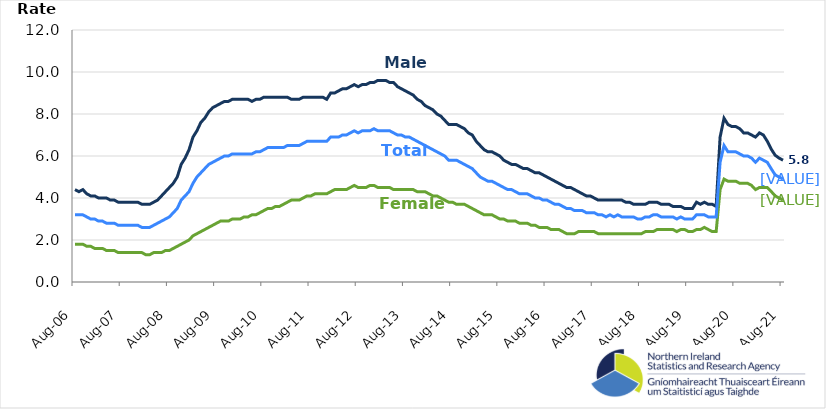
| Category | Male | Female | Total |
|---|---|---|---|
| 2006-08-01 | 4.4 | 1.8 | 3.2 |
| 2006-09-01 | 4.3 | 1.8 | 3.2 |
| 2006-10-01 | 4.4 | 1.8 | 3.2 |
| 2006-11-01 | 4.2 | 1.7 | 3.1 |
| 2006-12-01 | 4.1 | 1.7 | 3 |
| 2007-01-01 | 4.1 | 1.6 | 3 |
| 2007-02-01 | 4 | 1.6 | 2.9 |
| 2007-03-01 | 4 | 1.6 | 2.9 |
| 2007-04-01 | 4 | 1.5 | 2.8 |
| 2007-05-01 | 3.9 | 1.5 | 2.8 |
| 2007-06-01 | 3.9 | 1.5 | 2.8 |
| 2007-07-01 | 3.8 | 1.4 | 2.7 |
| 2007-08-01 | 3.8 | 1.4 | 2.7 |
| 2007-09-01 | 3.8 | 1.4 | 2.7 |
| 2007-10-01 | 3.8 | 1.4 | 2.7 |
| 2007-11-01 | 3.8 | 1.4 | 2.7 |
| 2007-12-01 | 3.8 | 1.4 | 2.7 |
| 2008-01-01 | 3.7 | 1.4 | 2.6 |
| 2008-02-01 | 3.7 | 1.3 | 2.6 |
| 2008-03-01 | 3.7 | 1.3 | 2.6 |
| 2008-04-01 | 3.8 | 1.4 | 2.7 |
| 2008-05-01 | 3.9 | 1.4 | 2.8 |
| 2008-06-01 | 4.1 | 1.4 | 2.9 |
| 2008-07-01 | 4.3 | 1.5 | 3 |
| 2008-08-01 | 4.5 | 1.5 | 3.1 |
| 2008-09-01 | 4.7 | 1.6 | 3.3 |
| 2008-10-01 | 5 | 1.7 | 3.5 |
| 2008-11-01 | 5.6 | 1.8 | 3.9 |
| 2008-12-01 | 5.9 | 1.9 | 4.1 |
| 2009-01-01 | 6.3 | 2 | 4.3 |
| 2009-02-01 | 6.9 | 2.2 | 4.7 |
| 2009-03-01 | 7.2 | 2.3 | 5 |
| 2009-04-01 | 7.6 | 2.4 | 5.2 |
| 2009-05-01 | 7.8 | 2.5 | 5.4 |
| 2009-06-01 | 8.1 | 2.6 | 5.6 |
| 2009-07-01 | 8.3 | 2.7 | 5.7 |
| 2009-08-01 | 8.4 | 2.8 | 5.8 |
| 2009-09-01 | 8.5 | 2.9 | 5.9 |
| 2009-10-01 | 8.6 | 2.9 | 6 |
| 2009-11-01 | 8.6 | 2.9 | 6 |
| 2009-12-01 | 8.7 | 3 | 6.1 |
| 2010-01-01 | 8.7 | 3 | 6.1 |
| 2010-02-01 | 8.7 | 3 | 6.1 |
| 2010-03-01 | 8.7 | 3.1 | 6.1 |
| 2010-04-01 | 8.7 | 3.1 | 6.1 |
| 2010-05-01 | 8.6 | 3.2 | 6.1 |
| 2010-06-01 | 8.7 | 3.2 | 6.2 |
| 2010-07-01 | 8.7 | 3.3 | 6.2 |
| 2010-08-01 | 8.8 | 3.4 | 6.3 |
| 2010-09-01 | 8.8 | 3.5 | 6.4 |
| 2010-10-01 | 8.8 | 3.5 | 6.4 |
| 2010-11-01 | 8.8 | 3.6 | 6.4 |
| 2010-12-01 | 8.8 | 3.6 | 6.4 |
| 2011-01-01 | 8.8 | 3.7 | 6.4 |
| 2011-02-01 | 8.8 | 3.8 | 6.5 |
| 2011-03-01 | 8.7 | 3.9 | 6.5 |
| 2011-04-01 | 8.7 | 3.9 | 6.5 |
| 2011-05-01 | 8.7 | 3.9 | 6.5 |
| 2011-06-01 | 8.8 | 4 | 6.6 |
| 2011-07-01 | 8.8 | 4.1 | 6.7 |
| 2011-08-01 | 8.8 | 4.1 | 6.7 |
| 2011-09-01 | 8.8 | 4.2 | 6.7 |
| 2011-10-01 | 8.8 | 4.2 | 6.7 |
| 2011-11-01 | 8.8 | 4.2 | 6.7 |
| 2011-12-01 | 8.7 | 4.2 | 6.7 |
| 2012-01-01 | 9 | 4.3 | 6.9 |
| 2012-02-01 | 9 | 4.4 | 6.9 |
| 2012-03-01 | 9.1 | 4.4 | 6.9 |
| 2012-04-01 | 9.2 | 4.4 | 7 |
| 2012-05-01 | 9.2 | 4.4 | 7 |
| 2012-06-01 | 9.3 | 4.5 | 7.1 |
| 2012-07-01 | 9.4 | 4.6 | 7.2 |
| 2012-08-01 | 9.3 | 4.5 | 7.1 |
| 2012-09-01 | 9.4 | 4.5 | 7.2 |
| 2012-10-01 | 9.4 | 4.5 | 7.2 |
| 2012-11-01 | 9.5 | 4.6 | 7.2 |
| 2012-12-01 | 9.5 | 4.6 | 7.3 |
| 2013-01-01 | 9.6 | 4.5 | 7.2 |
| 2013-02-01 | 9.6 | 4.5 | 7.2 |
| 2013-03-01 | 9.6 | 4.5 | 7.2 |
| 2013-04-01 | 9.5 | 4.5 | 7.2 |
| 2013-05-01 | 9.5 | 4.4 | 7.1 |
| 2013-06-01 | 9.3 | 4.4 | 7 |
| 2013-07-01 | 9.2 | 4.4 | 7 |
| 2013-08-01 | 9.1 | 4.4 | 6.9 |
| 2013-09-01 | 9 | 4.4 | 6.9 |
| 2013-10-01 | 8.9 | 4.4 | 6.8 |
| 2013-11-01 | 8.7 | 4.3 | 6.7 |
| 2013-12-01 | 8.6 | 4.3 | 6.6 |
| 2014-01-01 | 8.4 | 4.3 | 6.5 |
| 2014-02-01 | 8.3 | 4.2 | 6.4 |
| 2014-03-01 | 8.2 | 4.1 | 6.3 |
| 2014-04-01 | 8 | 4.1 | 6.2 |
| 2014-05-01 | 7.9 | 4 | 6.1 |
| 2014-06-01 | 7.7 | 3.9 | 6 |
| 2014-07-01 | 7.5 | 3.8 | 5.8 |
| 2014-08-01 | 7.5 | 3.8 | 5.8 |
| 2014-09-01 | 7.5 | 3.7 | 5.8 |
| 2014-10-01 | 7.4 | 3.7 | 5.7 |
| 2014-11-01 | 7.3 | 3.7 | 5.6 |
| 2014-12-01 | 7.1 | 3.6 | 5.5 |
| 2015-01-01 | 7 | 3.5 | 5.4 |
| 2015-02-01 | 6.7 | 3.4 | 5.2 |
| 2015-03-01 | 6.5 | 3.3 | 5 |
| 2015-04-01 | 6.3 | 3.2 | 4.9 |
| 2015-05-01 | 6.2 | 3.2 | 4.8 |
| 2015-06-01 | 6.2 | 3.2 | 4.8 |
| 2015-07-01 | 6.1 | 3.1 | 4.7 |
| 2015-08-01 | 6 | 3 | 4.6 |
| 2015-09-01 | 5.8 | 3 | 4.5 |
| 2015-10-01 | 5.7 | 2.9 | 4.4 |
| 2015-11-01 | 5.6 | 2.9 | 4.4 |
| 2015-12-01 | 5.6 | 2.9 | 4.3 |
| 2016-01-01 | 5.5 | 2.8 | 4.2 |
| 2016-02-01 | 5.4 | 2.8 | 4.2 |
| 2016-03-01 | 5.4 | 2.8 | 4.2 |
| 2016-04-01 | 5.3 | 2.7 | 4.1 |
| 2016-05-01 | 5.2 | 2.7 | 4 |
| 2016-06-01 | 5.2 | 2.6 | 4 |
| 2016-07-01 | 5.1 | 2.6 | 3.9 |
| 2016-08-01 | 5 | 2.6 | 3.9 |
| 2016-09-01 | 4.9 | 2.5 | 3.8 |
| 2016-10-01 | 4.8 | 2.5 | 3.7 |
| 2016-11-01 | 4.7 | 2.5 | 3.7 |
| 2016-12-01 | 4.6 | 2.4 | 3.6 |
| 2017-01-01 | 4.5 | 2.3 | 3.5 |
| 2017-02-01 | 4.5 | 2.3 | 3.5 |
| 2017-03-01 | 4.4 | 2.3 | 3.4 |
| 2017-04-01 | 4.3 | 2.4 | 3.4 |
| 2017-05-01 | 4.2 | 2.4 | 3.4 |
| 2017-06-01 | 4.1 | 2.4 | 3.3 |
| 2017-07-01 | 4.1 | 2.4 | 3.3 |
| 2017-08-01 | 4 | 2.4 | 3.3 |
| 2017-09-01 | 3.9 | 2.3 | 3.2 |
| 2017-10-01 | 3.9 | 2.3 | 3.2 |
| 2017-11-01 | 3.9 | 2.3 | 3.1 |
| 2017-12-01 | 3.9 | 2.3 | 3.2 |
| 2018-01-01 | 3.9 | 2.3 | 3.1 |
| 2018-02-01 | 3.9 | 2.3 | 3.2 |
| 2018-03-01 | 3.9 | 2.3 | 3.1 |
| 2018-04-01 | 3.8 | 2.3 | 3.1 |
| 2018-05-01 | 3.8 | 2.3 | 3.1 |
| 2018-06-01 | 3.7 | 2.3 | 3.1 |
| 2018-07-01 | 3.7 | 2.3 | 3 |
| 2018-08-01 | 3.7 | 2.3 | 3 |
| 2018-09-01 | 3.7 | 2.4 | 3.1 |
| 2018-10-01 | 3.8 | 2.4 | 3.1 |
| 2018-11-01 | 3.8 | 2.4 | 3.2 |
| 2018-12-01 | 3.8 | 2.5 | 3.2 |
| 2019-01-01 | 3.7 | 2.5 | 3.1 |
| 2019-02-01 | 3.7 | 2.5 | 3.1 |
| 2019-03-01 | 3.7 | 2.5 | 3.1 |
| 2019-04-01 | 3.6 | 2.5 | 3.1 |
| 2019-05-01 | 3.6 | 2.4 | 3 |
| 2019-06-01 | 3.6 | 2.5 | 3.1 |
| 2019-07-01 | 3.5 | 2.5 | 3 |
| 2019-08-01 | 3.5 | 2.4 | 3 |
| 2019-09-01 | 3.5 | 2.4 | 3 |
| 2019-10-01 | 3.8 | 2.5 | 3.2 |
| 2019-11-01 | 3.7 | 2.5 | 3.2 |
| 2019-12-01 | 3.8 | 2.6 | 3.2 |
| 2020-01-01 | 3.7 | 2.5 | 3.1 |
| 2020-02-01 | 3.7 | 2.4 | 3.1 |
| 2020-03-01 | 3.6 | 2.4 | 3.1 |
| 2020-04-01 | 6.9 | 4.4 | 5.7 |
| 2020-05-01 | 7.8 | 4.9 | 6.5 |
| 2020-06-01 | 7.5 | 4.8 | 6.2 |
| 2020-07-01 | 7.4 | 4.8 | 6.2 |
| 2020-08-01 | 7.4 | 4.8 | 6.2 |
| 2020-09-01 | 7.3 | 4.7 | 6.1 |
| 2020-10-01 | 7.1 | 4.7 | 6 |
| 2020-11-01 | 7.1 | 4.7 | 6 |
| 2020-12-01 | 7 | 4.6 | 5.9 |
| 2021-01-01 | 6.9 | 4.4 | 5.7 |
| 2021-02-01 | 7.1 | 4.5 | 5.9 |
| 2021-03-01 | 7 | 4.5 | 5.8 |
| 2021-04-01 | 6.7 | 4.5 | 5.7 |
| 2021-05-01 | 6.326 | 4.311 | 5.393 |
| 2021-06-01 | 6.036 | 4.1 | 5.1 |
| 2021-07-01 | 5.9 | 4 | 5 |
| 2021-08-01 | 5.8 | 3.9 | 4.9 |